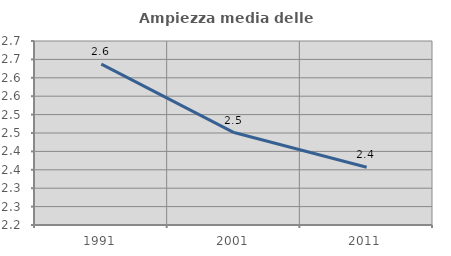
| Category | Ampiezza media delle famiglie |
|---|---|
| 1991.0 | 2.637 |
| 2001.0 | 2.451 |
| 2011.0 | 2.357 |